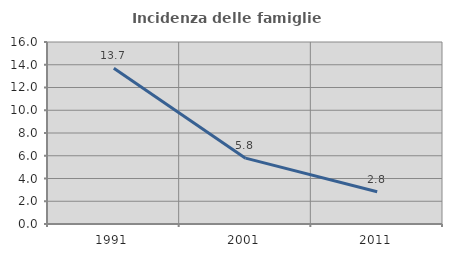
| Category | Incidenza delle famiglie numerose |
|---|---|
| 1991.0 | 13.683 |
| 2001.0 | 5.789 |
| 2011.0 | 2.836 |